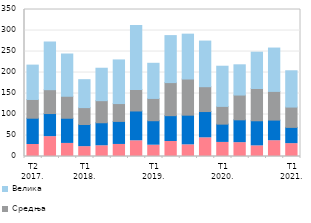
| Category | Микропредузећа | Мала | Средња | Велика |
|---|---|---|---|---|
| T2
2017. | 28.601 | 62.573 | 44.608 | 81.806 |
|  | 47.306 | 54.987 | 56.8 | 113.518 |
|  | 31.129 | 59.946 | 52.372 | 100.581 |
| T1
2018. | 23.458 | 52.774 | 40.183 | 66.517 |
|  | 25.544 | 54.802 | 52.603 | 77.229 |
|  | 28.673 | 54.873 | 42.484 | 103.899 |
|  | 37.41 | 70.984 | 51.038 | 152.215 |
| T1
2019. | 26.913 | 58.293 | 53.033 | 83.702 |
|  | 35.763 | 61.475 | 78.723 | 111.897 |
|  | 27.759 | 70.634 | 86.103 | 106.825 |
|  | 44.489 | 62.561 | 59.132 | 108.665 |
| T1
2020. | 33.497 | 43.549 | 42.255 | 95.672 |
|  | 32.96 | 54.335 | 59 | 72.028 |
|  | 25.293 | 59.78 | 76.792 | 86.501 |
|  | 37.626 | 49.063 | 68.305 | 103.2 |
| T1
2021. | 30.617 | 38.71 | 48.392 | 86.375 |